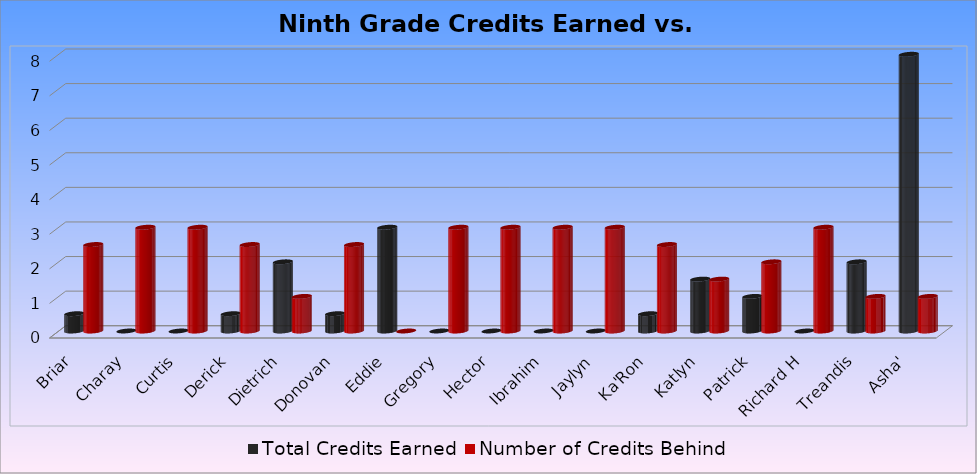
| Category | Total Credits Earned | Number of Credits Behind |
|---|---|---|
| Briar | 0.5 | 2.5 |
| Charay | 0 | 3 |
| Curtis | 0 | 3 |
| Derick | 0.5 | 2.5 |
| Dietrich | 2 | 1 |
| Donovan | 0.5 | 2.5 |
| Eddie | 3 | 0 |
| Gregory | 0 | 3 |
| Hector | 0 | 3 |
| Ibrahim | 0 | 3 |
| Jaylyn | 0 | 3 |
| Ka'Ron | 0.5 | 2.5 |
| Katlyn | 1.5 | 1.5 |
| Patrick | 1 | 2 |
| Richard H | 0 | 3 |
| Treandis | 2 | 1 |
|  Asha' | 8 | 1 |